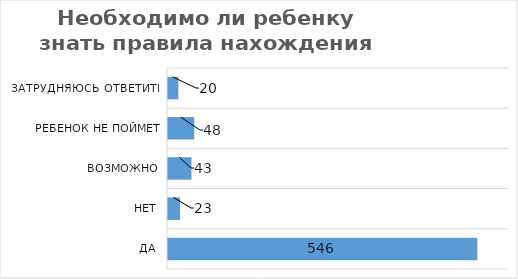
| Category | Series 0 |
|---|---|
| Да | 546 |
| Нет | 23 |
| Возможно | 43 |
| Ребенок не поймет | 48 |
| Затрудняюсь ответить | 20 |